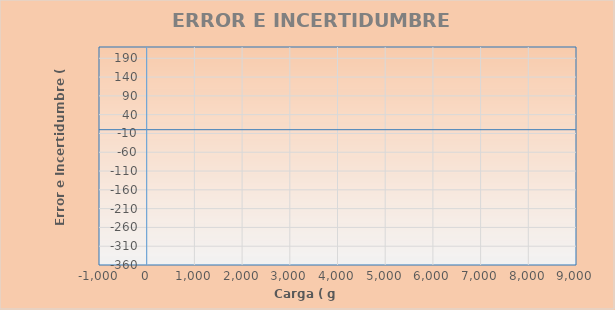
| Category | ERROR (mg) |
|---|---|
| #N/A | 0 |
| #N/A | 0 |
| #N/A | 0 |
| #N/A | 0 |
| #N/A | 0 |